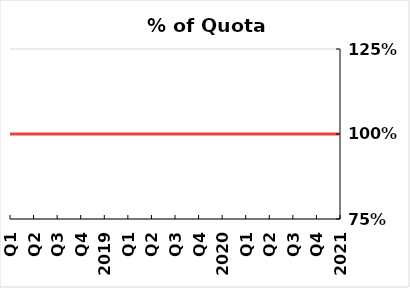
| Category | % of Annual Quota | Quota |
|---|---|---|
| 2021 | 0 | 1 |
| Q4 | 0 | 1 |
| Q3 | 0 | 1 |
| Q2 | 0 | 1 |
| Q1 | 0 | 1 |
| 2020 | 0 | 1 |
| Q4 | 0 | 1 |
| Q3 | 0 | 1 |
| Q2 | 0 | 1 |
| Q1 | 0 | 1 |
| 2019 | 0 | 1 |
| Q4 | 0 | 1 |
| Q3 | 0 | 1 |
| Q2 | 0 | 1 |
| Q1 | 0 | 1 |